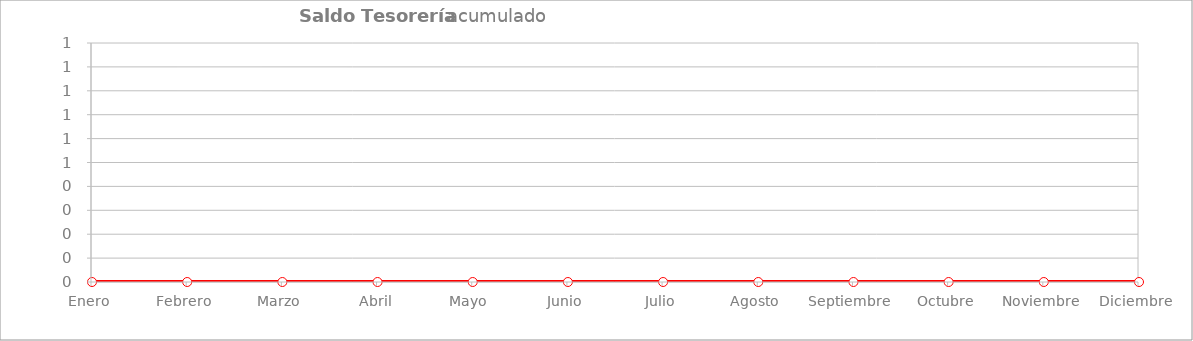
| Category | gastos |
|---|---|
| Enero | 0 |
| Febrero | 0 |
| Marzo | 0 |
| Abril | 0 |
| Mayo  | 0 |
| Junio | 0 |
| Julio | 0 |
| Agosto | 0 |
| Septiembre | 0 |
| Octubre | 0 |
| Noviembre | 0 |
| Diciembre | 0 |